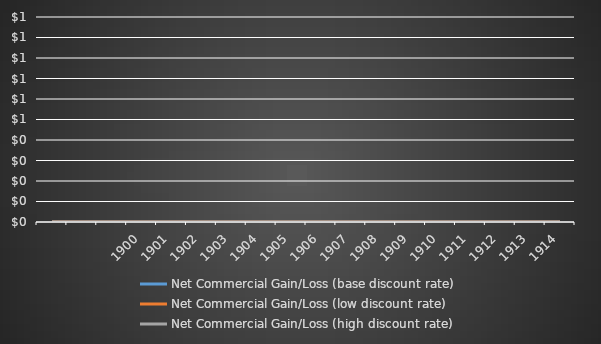
| Category | Net Commercial Gain/Loss (base discount rate) | Net Commercial Gain/Loss (low discount rate) | Net Commercial Gain/Loss (high discount rate) |
|---|---|---|---|
|  | 0 | 0 | 0 |
|  | 0 | 0 | 0 |
|  | 0 | 0 | 0 |
| 1900 | 0 | 0 | 0 |
| 1901 | 0 | 0 | 0 |
| 1902 | 0 | 0 | 0 |
| 1903 | 0 | 0 | 0 |
| 1904 | 0 | 0 | 0 |
| 1905 | 0 | 0 | 0 |
| 1906 | 0 | 0 | 0 |
| 1907 | 0 | 0 | 0 |
| 1908 | 0 | 0 | 0 |
| 1909 | 0 | 0 | 0 |
| 1910 | 0 | 0 | 0 |
| 1911 | 0 | 0 | 0 |
| 1912 | 0 | 0 | 0 |
| 1913 | 0 | 0 | 0 |
| 1914 | 0 | 0 | 0 |